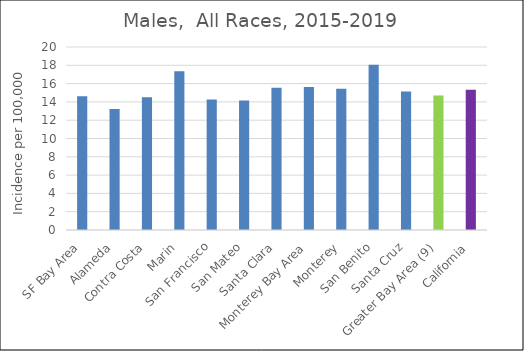
| Category | Male |
|---|---|
| SF Bay Area | 14.63 |
|   Alameda | 13.22 |
|   Contra Costa | 14.51 |
|   Marin | 17.36 |
|   San Francisco | 14.27 |
|   San Mateo | 14.16 |
|   Santa Clara | 15.55 |
| Monterey Bay Area | 15.63 |
|   Monterey | 15.44 |
|   San Benito | 18.05 |
|   Santa Cruz | 15.15 |
| Greater Bay Area (9) | 14.71 |
| California | 15.34 |